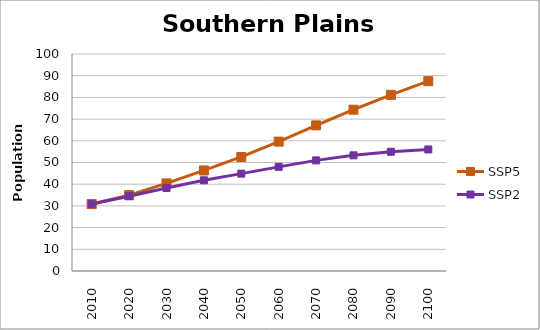
| Category | SSP5 | SSP2 |
|---|---|---|
| 2010.0 | 30846426 | 30846426 |
| 2020.0 | 34956054 | 34476249 |
| 2030.0 | 40381764 | 38239802 |
| 2040.0 | 46339781 | 41797237 |
| 2050.0 | 52547650 | 44867352 |
| 2060.0 | 59616551 | 47991390 |
| 2070.0 | 67104073 | 50973895 |
| 2080.0 | 74323717 | 53301407 |
| 2090.0 | 81165916 | 54958549 |
| 2100.0 | 87483179 | 56013955 |